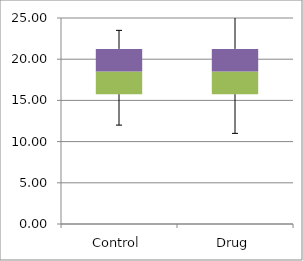
| Category | Min | Q1-Min | Med-Q1 | Q3-Med |
|---|---|---|---|---|
| Control | 12 | 3.75 | 2.75 | 2.75 |
| Drug | 11 | 4.75 | 2.75 | 2.75 |